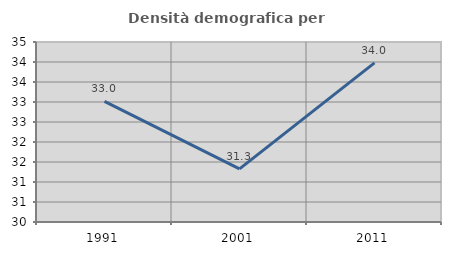
| Category | Densità demografica |
|---|---|
| 1991.0 | 33.017 |
| 2001.0 | 31.329 |
| 2011.0 | 33.979 |